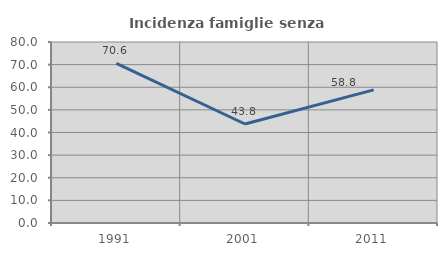
| Category | Incidenza famiglie senza nuclei |
|---|---|
| 1991.0 | 70.588 |
| 2001.0 | 43.75 |
| 2011.0 | 58.824 |